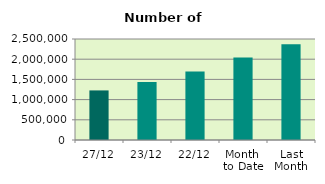
| Category | Series 0 |
|---|---|
| 27/12 | 1227260 |
| 23/12 | 1438060 |
| 22/12 | 1695548 |
| Month 
to Date | 2043842.222 |
| Last
Month | 2367033.455 |